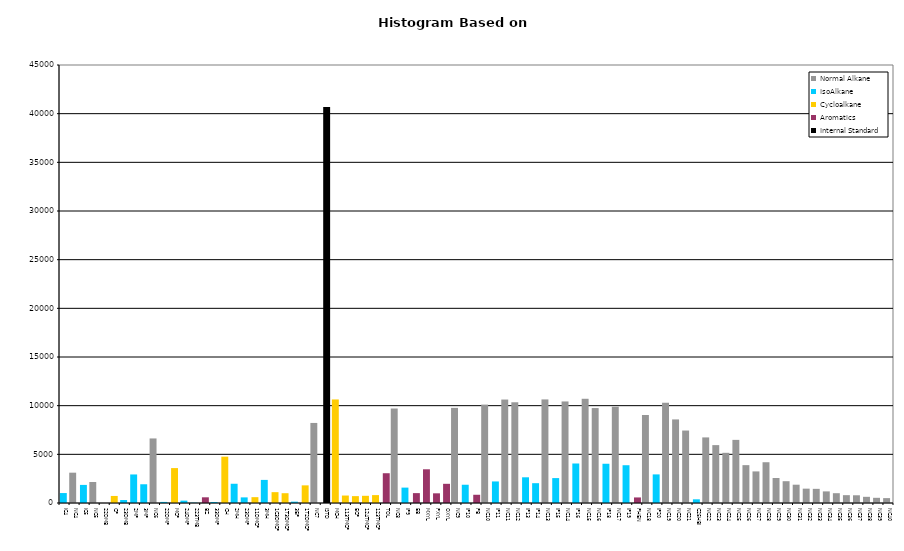
| Category | Normal Alkane | IsoAlkane | Cycloalkane | Aromatics | Internal Standard |
|---|---|---|---|---|---|
| IC4 | 0 | 1022 | 0 | 0 | 0 |
| NC4 | 3115 | 0 | 0 | 0 | 0 |
| IC5 | 0 | 1859 | 0 | 0 | 0 |
| NC5 | 2160 | 0 | 0 | 0 | 0 |
| 22DMB | 0 | 0 | 0 | 0 | 0 |
| CP | 0 | 0 | 724 | 0 | 0 |
| 23DMB | 0 | 305 | 0 | 0 | 0 |
| 2MP | 0 | 2933 | 0 | 0 | 0 |
| 3MP | 0 | 1925 | 0 | 0 | 0 |
| NC6 | 6633 | 0 | 0 | 0 | 0 |
| 22DMP | 0 | 111 | 0 | 0 | 0 |
| MCP | 0 | 0 | 3587 | 0 | 0 |
| 24DMP | 0 | 244 | 0 | 0 | 0 |
| 223TMB | 0 | 34 | 0 | 0 | 0 |
| BZ | 0 | 0 | 0 | 585 | 0 |
| 33DMP | 0 | 101 | 0 | 0 | 0 |
| CH | 0 | 0 | 4761 | 0 | 0 |
| 2MH | 0 | 1977 | 0 | 0 | 0 |
| 23DMP | 0 | 577 | 0 | 0 | 0 |
| 11DMCP | 0 | 0 | 600 | 0 | 0 |
| 3MH | 0 | 2373 | 0 | 0 | 0 |
| 1C3DMCP | 0 | 0 | 1114 | 0 | 0 |
| 1T3DMCP | 0 | 0 | 1006 | 0 | 0 |
| 3EP | 0 | 139 | 0 | 0 | 0 |
| 1T2DMCP | 0 | 0 | 1813 | 0 | 0 |
| NC7 | 8225 | 0 | 0 | 0 | 0 |
| ISTD | 0 | 0 | 0 | 0 | 40697 |
| MCH | 0 | 0 | 10638 | 0 | 0 |
| 113TMCP | 0 | 0 | 767 | 0 | 0 |
| ECP | 0 | 0 | 706 | 0 | 0 |
| 124TMCP | 0 | 0 | 739 | 0 | 0 |
| 123TMCP | 0 | 0 | 812 | 0 | 0 |
| TOL | 0 | 0 | 0 | 3059 | 0 |
| NC8 | 9708 | 0 | 0 | 0 | 0 |
| IP9 | 0 | 1581 | 0 | 0 | 0 |
| EB | 0 | 0 | 0 | 1015 | 0 |
| MXYL | 0 | 0 | 0 | 3463 | 0 |
| PXYL | 0 | 0 | 0 | 995 | 0 |
| OXYL | 0 | 0 | 0 | 1971 | 0 |
| NC9 | 9772 | 0 | 0 | 0 | 0 |
| IP10 | 0 | 1876 | 0 | 0 | 0 |
| PB | 0 | 0 | 0 | 846 | 0 |
| NC10 | 10108 | 0 | 0 | 0 | 0 |
| IP11 | 0 | 2215 | 0 | 0 | 0 |
| NC11 | 10629 | 0 | 0 | 0 | 0 |
| NC12 | 10348 | 0 | 0 | 0 | 0 |
| IP13 | 0 | 2641 | 0 | 0 | 0 |
| IP14 | 0 | 2036 | 0 | 0 | 0 |
| NC13 | 10642 | 0 | 0 | 0 | 0 |
| IP15 | 0 | 2559 | 0 | 0 | 0 |
| NC14 | 10433 | 0 | 0 | 0 | 0 |
| IP16 | 0 | 4059 | 0 | 0 | 0 |
| NC15 | 10708 | 0 | 0 | 0 | 0 |
| NC16 | 9754 | 0 | 0 | 0 | 0 |
| IP18 | 0 | 4033 | 0 | 0 | 0 |
| NC17 | 9893 | 0 | 0 | 0 | 0 |
| IP19 | 0 | 3881 | 0 | 0 | 0 |
| PHEN | 0 | 0 | 0 | 571 | 0 |
| NC18 | 9042 | 0 | 0 | 0 | 0 |
| IP20 | 0 | 2939 | 0 | 0 | 0 |
| NC19 | 10299 | 0 | 0 | 0 | 0 |
| NC20 | 8587 | 0 | 0 | 0 | 0 |
| NC21 | 7445 | 0 | 0 | 0 | 0 |
| C25HBI | 0 | 379 | 0 | 0 | 0 |
| NC22 | 6739 | 0 | 0 | 0 | 0 |
| NC23 | 5947 | 0 | 0 | 0 | 0 |
| NC24 | 5156 | 0 | 0 | 0 | 0 |
| NC25 | 6485 | 0 | 0 | 0 | 0 |
| NC26 | 3889 | 0 | 0 | 0 | 0 |
| NC27 | 3246 | 0 | 0 | 0 | 0 |
| NC28 | 4189 | 0 | 0 | 0 | 0 |
| NC29 | 2569 | 0 | 0 | 0 | 0 |
| NC30 | 2240 | 0 | 0 | 0 | 0 |
| NC31 | 1881 | 0 | 0 | 0 | 0 |
| NC32 | 1474 | 0 | 0 | 0 | 0 |
| NC33 | 1455 | 0 | 0 | 0 | 0 |
| NC34 | 1193 | 0 | 0 | 0 | 0 |
| NC35 | 1007 | 0 | 0 | 0 | 0 |
| NC36 | 805 | 0 | 0 | 0 | 0 |
| NC37 | 793 | 0 | 0 | 0 | 0 |
| NC38 | 635 | 0 | 0 | 0 | 0 |
| NC39 | 533 | 0 | 0 | 0 | 0 |
| NC40 | 502 | 0 | 0 | 0 | 0 |